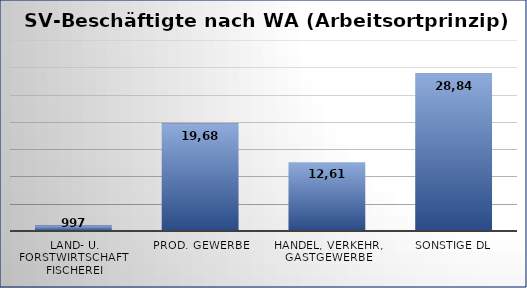
| Category | Series 0 |
|---|---|
| Land- u. Forstwirtschaft  Fischerei | 997 |
| Prod. Gewerbe | 19688 |
| Handel, Verkehr, Gastgewerbe | 12612 |
| sonstige DL | 28844 |